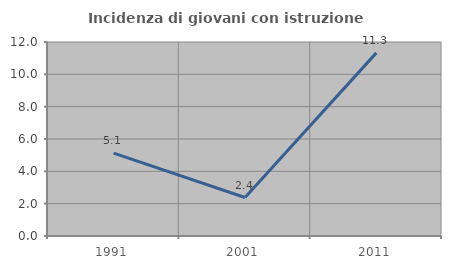
| Category | Incidenza di giovani con istruzione universitaria |
|---|---|
| 1991.0 | 5.128 |
| 2001.0 | 2.381 |
| 2011.0 | 11.327 |